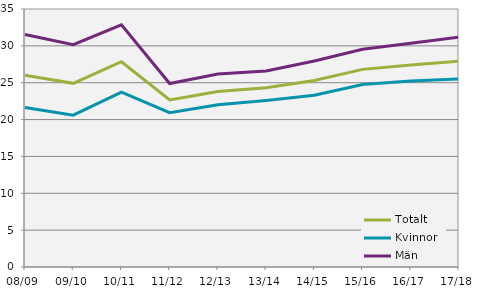
| Category | Totalt | Kvinnor  | Män |
|---|---|---|---|
| 08/09 | 26.015 | 21.633 | 31.549 |
| 09/10 | 24.916 | 20.605 | 30.165 |
| 10/11 | 27.849 | 23.708 | 32.858 |
| 11/12 | 22.656 | 20.934 | 24.885 |
| 12/13 | 23.809 | 22.011 | 26.19 |
| 13/14 | 24.322 | 22.6 | 26.585 |
| 14/15 | 25.301 | 23.292 | 27.938 |
| 15/16 | 26.809 | 24.748 | 29.546 |
| 16/17 | 27.407 | 25.22 | 30.36 |
| 17/18 | 27.909 | 25.526 | 31.191 |